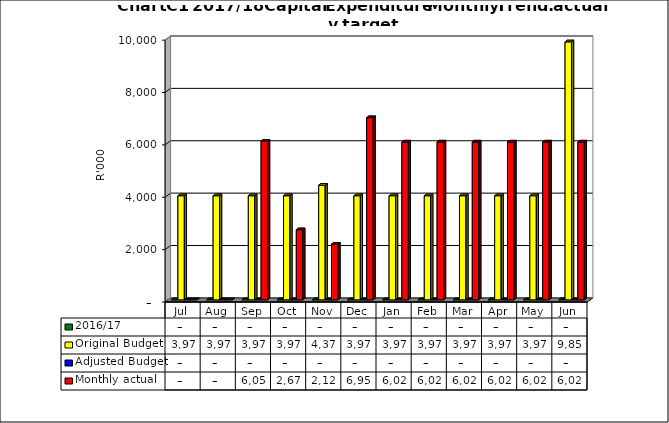
| Category | 2016/17 | Original Budget | Adjusted Budget | Monthly actual |
|---|---|---|---|---|
| Jul | 0 | 3975000 | 0 | 0 |
| Aug | 0 | 3975000 | 0 | 0 |
| Sep | 0 | 3975000 | 0 | 6058010 |
| Oct | 0 | 3975000 | 0 | 2674995 |
| Nov | 0 | 4375000 | 0 | 2125785 |
| Dec | 0 | 3975000 | 0 | 6956796 |
| Jan | 0 | 3975000 | 0 | 6027000 |
| Feb | 0 | 3975000 | 0 | 6027000 |
| Mar | 0 | 3975000 | 0 | 6027000 |
| Apr | 0 | 3975000 | 0 | 6027000 |
| May | 0 | 3975000 | 0 | 6027000 |
| Jun | 0 | 9851000 | 0 | 6027000 |